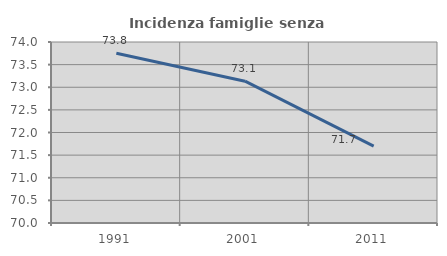
| Category | Incidenza famiglie senza nuclei |
|---|---|
| 1991.0 | 73.75 |
| 2001.0 | 73.134 |
| 2011.0 | 71.698 |